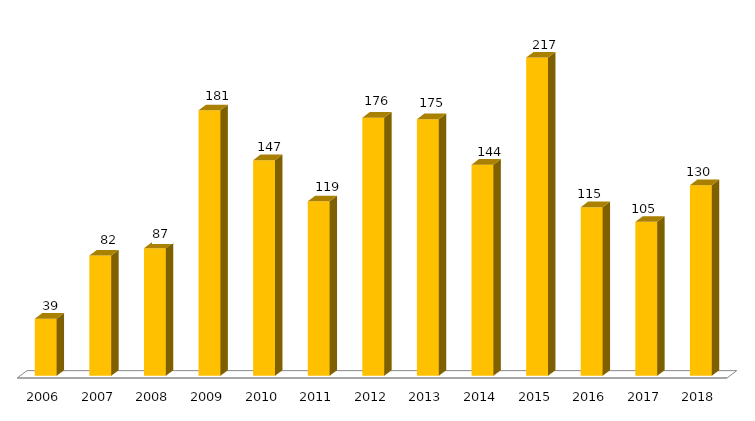
| Category | Iniciados (por exercício) |
|---|---|
| 2006.0 | 39 |
| 2007.0 | 82 |
| 2008.0 | 87 |
| 2009.0 | 181 |
| 2010.0 | 147 |
| 2011.0 | 119 |
| 2012.0 | 176 |
| 2013.0 | 175 |
| 2014.0 | 144 |
| 2015.0 | 217 |
| 2016.0 | 115 |
| 2017.0 | 105 |
| 2018.0 | 130 |